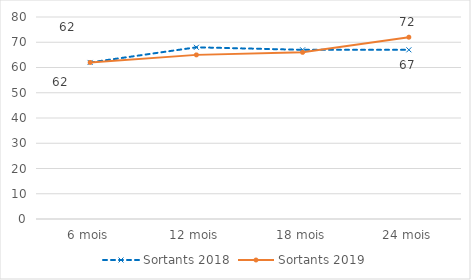
| Category | Sortants 2018 | Sortants 2019 |
|---|---|---|
| 6 mois | 62 | 62 |
| 12 mois | 68 | 65 |
| 18 mois | 67 | 66 |
| 24 mois | 67 | 72 |